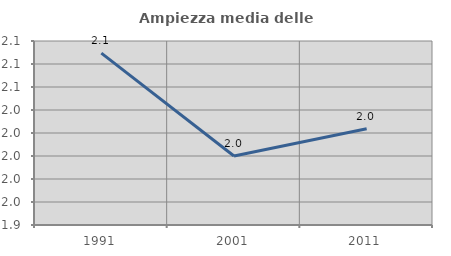
| Category | Ampiezza media delle famiglie |
|---|---|
| 1991.0 | 2.089 |
| 2001.0 | 2 |
| 2011.0 | 2.024 |